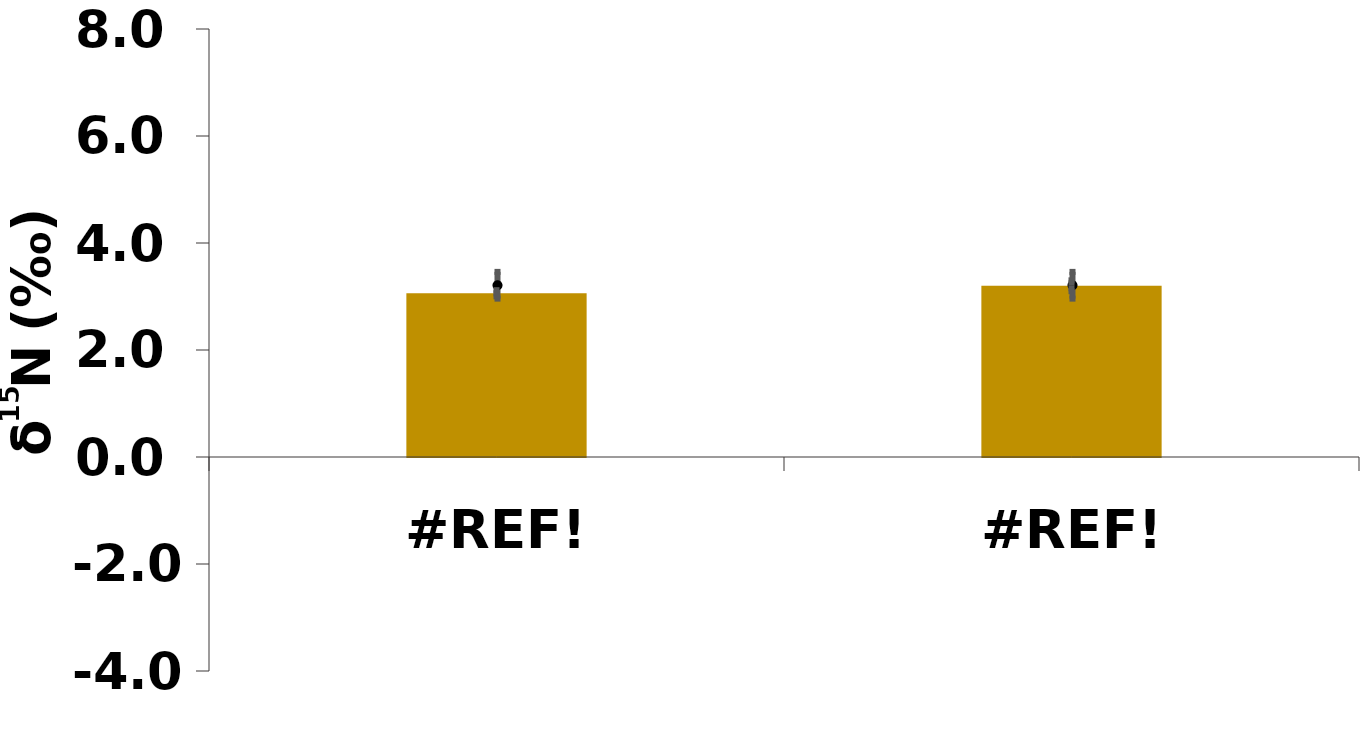
| Category | Whole plant |
|---|---|
| 0.0 | 3.06 |
| 0.0 | 3.2 |